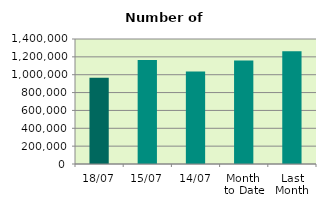
| Category | Series 0 |
|---|---|
| 18/07 | 965994 |
| 15/07 | 1164774 |
| 14/07 | 1035844 |
| Month 
to Date | 1158691.333 |
| Last
Month | 1263143.455 |